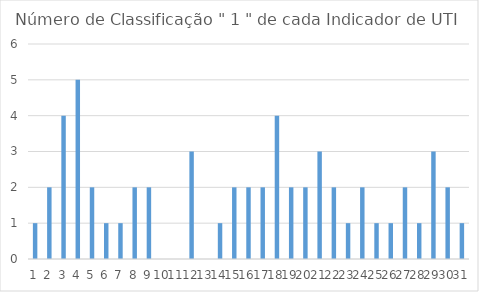
| Category | Series 0 |
|---|---|
| 0 | 1 |
| 1 | 2 |
| 2 | 4 |
| 3 | 5 |
| 4 | 2 |
| 5 | 1 |
| 6 | 1 |
| 7 | 2 |
| 8 | 2 |
| 9 | 0 |
| 10 | 0 |
| 11 | 3 |
| 12 | 0 |
| 13 | 1 |
| 14 | 2 |
| 15 | 2 |
| 16 | 2 |
| 17 | 4 |
| 18 | 2 |
| 19 | 2 |
| 20 | 3 |
| 21 | 2 |
| 22 | 1 |
| 23 | 2 |
| 24 | 1 |
| 25 | 1 |
| 26 | 2 |
| 27 | 1 |
| 28 | 3 |
| 29 | 2 |
| 30 | 1 |